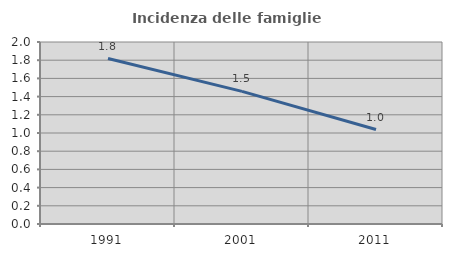
| Category | Incidenza delle famiglie numerose |
|---|---|
| 1991.0 | 1.818 |
| 2001.0 | 1.458 |
| 2011.0 | 1.038 |